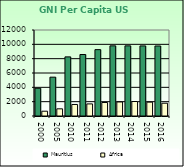
| Category | Mauritius | Africa                        |
|---|---|---|
| 2000.0 | 3870 | 668.557 |
| 2005.0 | 5420 | 1002.896 |
| 2010.0 | 8250 | 1608.999 |
| 2011.0 | 8580 | 1686.521 |
| 2012.0 | 9260 | 1885.129 |
| 2013.0 | 9790 | 1956.671 |
| 2014.0 | 9790 | 2022.289 |
| 2015.0 | 9780 | 1932.283 |
| 2016.0 | 9770 | 1781.415 |